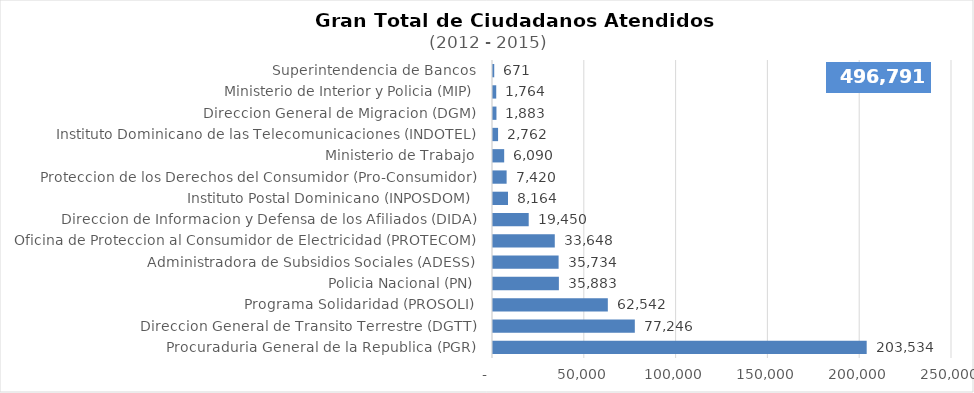
| Category | Series 0 |
|---|---|
| Procuraduria General de la Republica (PGR) | 203534 |
| Direccion General de Transito Terrestre (DGTT) | 77246 |
| Programa Solidaridad (PROSOLI) | 62542 |
| Policia Nacional (PN) | 35883 |
| Administradora de Subsidios Sociales (ADESS) | 35734 |
| Oficina de Proteccion al Consumidor de Electricidad (PROTECOM) | 33648 |
| Direccion de Informacion y Defensa de los Afiliados (DIDA) | 19450 |
| Instituto Postal Dominicano (INPOSDOM) | 8164 |
| Proteccion de los Derechos del Consumidor (Pro-Consumidor) | 7420 |
| Ministerio de Trabajo | 6090 |
| Instituto Dominicano de las Telecomunicaciones (INDOTEL) | 2762 |
| Direccion General de Migracion (DGM) | 1883 |
| Ministerio de Interior y Policia (MIP) | 1764 |
| Superintendencia de Bancos | 671 |